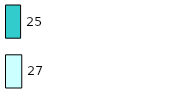
| Category | Series 0 | Series 1 |
|---|---|---|
| 0 | 27 | 25 |